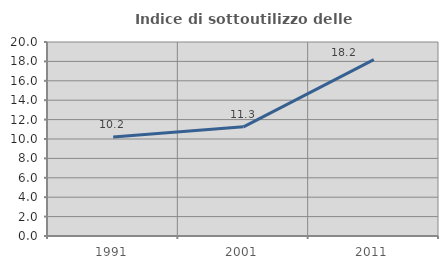
| Category | Indice di sottoutilizzo delle abitazioni  |
|---|---|
| 1991.0 | 10.204 |
| 2001.0 | 11.258 |
| 2011.0 | 18.182 |